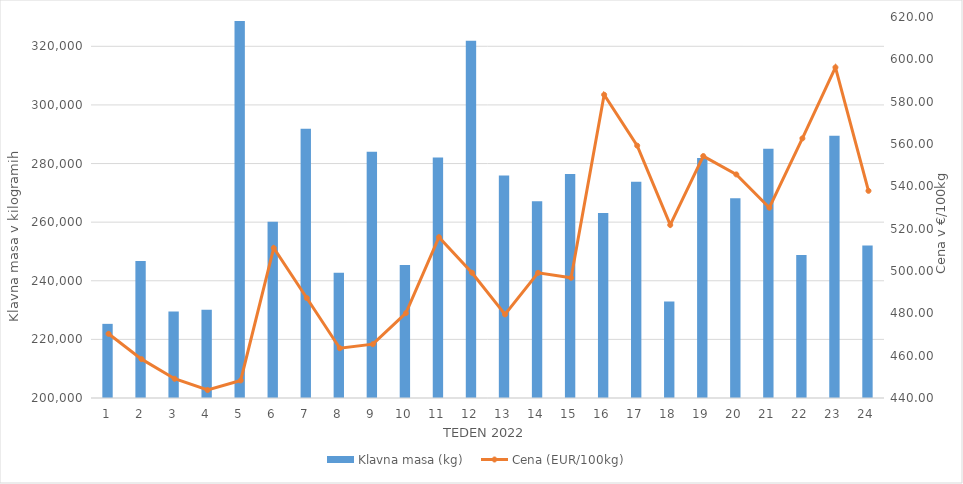
| Category | Klavna masa (kg) |
|---|---|
| 1.0 | 225300 |
| 2.0 | 246712 |
| 3.0 | 229541 |
| 4.0 | 230074 |
| 5.0 | 328640 |
| 6.0 | 260108 |
| 7.0 | 291887 |
| 8.0 | 242732 |
| 9.0 | 283987 |
| 10.0 | 245414 |
| 11.0 | 282092 |
| 12.0 | 321936 |
| 13.0 | 275950 |
| 14.0 | 267148 |
| 15.0 | 276417 |
| 16.0 | 263098 |
| 17.0 | 273824 |
| 18.0 | 232926 |
| 19.0 | 281859 |
| 20.0 | 268153 |
| 21.0 | 285073 |
| 22.0 | 248783 |
| 23.0 | 289478 |
| 24.0 | 252069 |